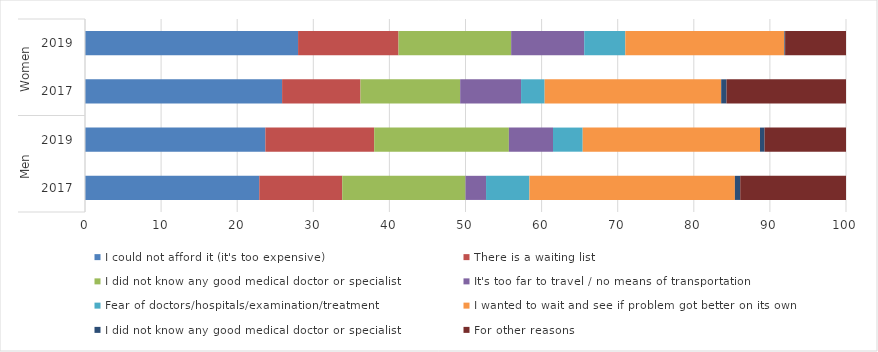
| Category | I could not afford it (it's too expensive) | There is a waiting list | I did not know any good medical doctor or specialist | It's too far to travel / no means of transportation | Fear of doctors/hospitals/examination/treatment | I wanted to wait and see if problem got better on its own | For other reasons |
|---|---|---|---|---|---|---|---|
| 0 | 22.9 | 10.9 | 0.7 | 2.7 | 5.7 | 27 | 13.9 |
| 1 | 23.7 | 14.3 | 0.6 | 5.8 | 3.9 | 23.3 | 10.7 |
| 2 | 25.9 | 10.3 | 0.7 | 8 | 3.1 | 23.2 | 15.7 |
| 3 | 28 | 13.2 | 0.1 | 9.6 | 5.4 | 20.9 | 8 |